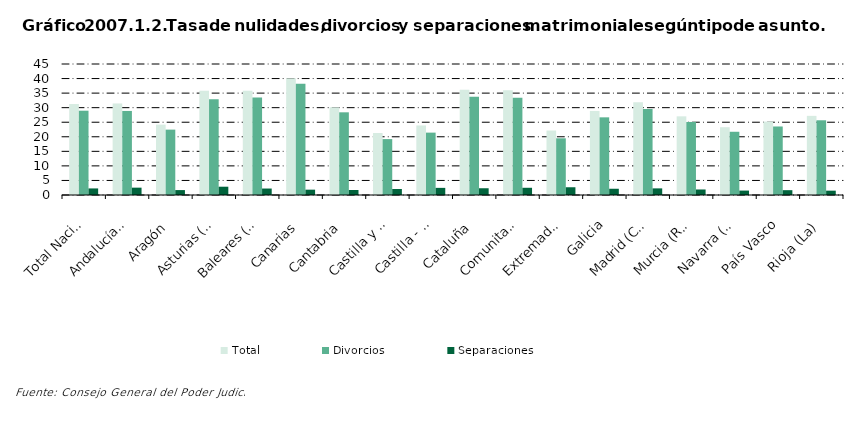
| Category | Total | Divorcios | Separaciones |
|---|---|---|---|
| Total Nacional | 31.261 | 28.959 | 2.259 |
| Andalucía(1) | 31.456 | 28.878 | 2.523 |
| Aragón | 24.17 | 22.458 | 1.689 |
| Asturias (Principado de) | 35.791 | 32.888 | 2.847 |
| Baleares (Illes) | 35.793 | 33.523 | 2.222 |
| Canarias | 40.105 | 38.224 | 1.831 |
| Cantabria | 30.131 | 28.403 | 1.728 |
| Castilla y León | 21.29 | 19.21 | 2.061 |
| Castilla - La Mancha | 23.891 | 21.428 | 2.453 |
| Cataluña | 36.153 | 33.791 | 2.32 |
| Comunitat Valenciana | 35.988 | 33.445 | 2.481 |
| Extremadura | 22.147 | 19.477 | 2.661 |
| Galicia | 28.88 | 26.68 | 2.146 |
| Madrid (Comunidad de) | 31.871 | 29.544 | 2.276 |
| Murcia (Región de) | 27.024 | 25.091 | 1.896 |
| Navarra (Comunidad Foral de) | 23.289 | 21.721 | 1.518 |
| País Vasco | 25.212 | 23.536 | 1.657 |
| Rioja (La) | 27.187 | 25.666 | 1.489 |